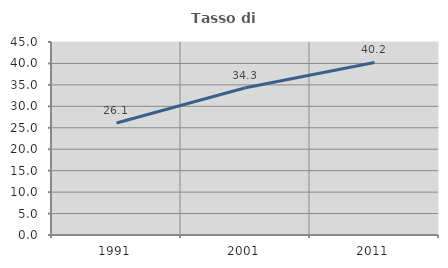
| Category | Tasso di occupazione   |
|---|---|
| 1991.0 | 26.106 |
| 2001.0 | 34.343 |
| 2011.0 | 40.23 |